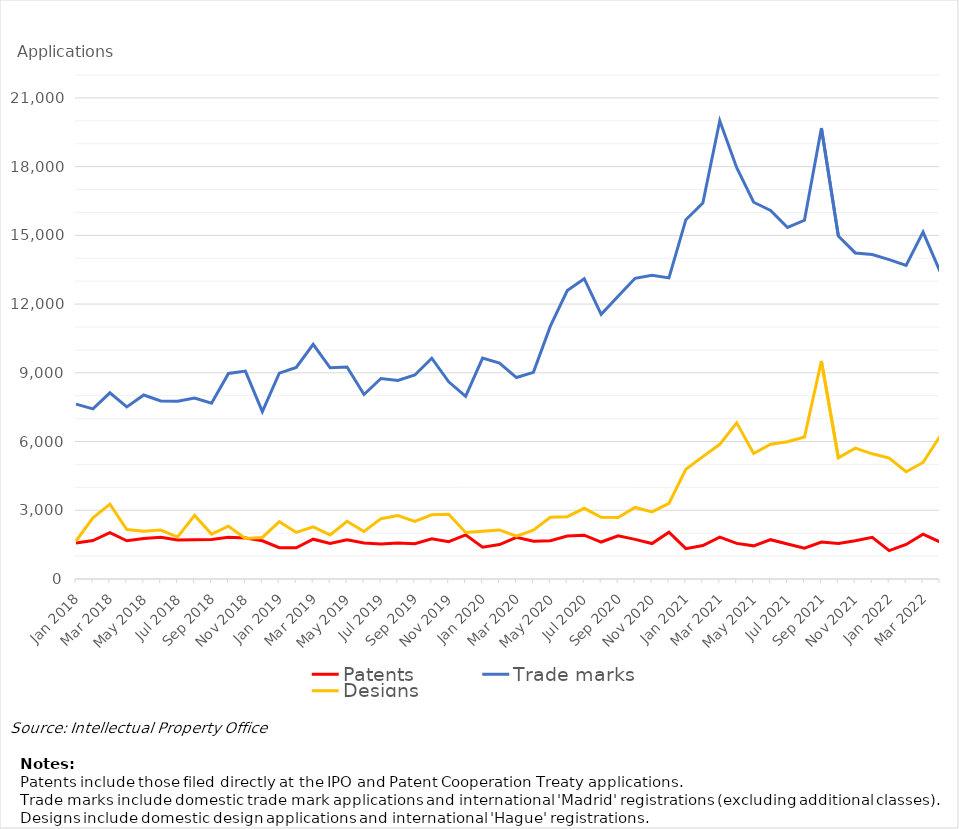
| Category | Patents | Trade marks | Designs |
|---|---|---|---|
| Jan 2018 | 1575 | 7634 | 1658 |
| Feb 2018 | 1676 | 7428 | 2672 |
| Mar 2018 | 2022 | 8127 | 3267 |
| Apr 2018 | 1670 | 7512 | 2160 |
| May 2018 | 1767 | 8030 | 2083 |
| Jun 2018 | 1821 | 7769 | 2136 |
| Jul 2018 | 1704 | 7757 | 1832 |
| Aug 2018 | 1713 | 7897 | 2777 |
| Sep 2018 | 1725 | 7673 | 1960 |
| Oct 2018 | 1818 | 8972 | 2302 |
| Nov 2018 | 1787 | 9076 | 1765 |
| Dec 2018 | 1670 | 7304 | 1815 |
| Jan 2019 | 1367 | 8985 | 2505 |
| Feb 2019 | 1361 | 9234 | 2031 |
| Mar 2019 | 1737 | 10243 | 2274 |
| Apr 2019 | 1552 | 9219 | 1923 |
| May 2019 | 1710 | 9251 | 2520 |
| Jun 2019 | 1569 | 8053 | 2074 |
| Jul 2019 | 1527 | 8752 | 2634 |
| Aug 2019 | 1571 | 8670 | 2768 |
| Sep 2019 | 1540 | 8907 | 2511 |
| Oct 2019 | 1755 | 9636 | 2800 |
| Nov 2019 | 1630 | 8607 | 2827 |
| Dec 2019 | 1926 | 7970 | 2028 |
| Jan 2020 | 1391 | 9642 | 2082 |
| Feb 2020 | 1505 | 9428 | 2143 |
| Mar 2020 | 1818 | 8794 | 1871 |
| Apr 2020 | 1648 | 9021 | 2127 |
| May 2020 | 1672 | 11035 | 2695 |
| Jun 2020 | 1879 | 12593 | 2721 |
| Jul 2020 | 1912 | 13110 | 3086 |
| Aug 2020 | 1614 | 11551 | 2694 |
| Sep 2020 | 1885 | 12340 | 2686 |
| Oct 2020 | 1730 | 13126 | 3124 |
| Nov 2020 | 1547 | 13254 | 2930 |
| Dec 2020 | 2043 | 13144 | 3302 |
| Jan 2021 | 1324 | 15685 | 4792 |
| Feb 2021 | 1462 | 16412 | 5341 |
| Mar 2021 | 1828 | 20001 | 5879 |
| Apr 2021 | 1555 | 17951 | 6815 |
| May 2021 | 1447 | 16446 | 5480 |
| Jun 2021 | 1716 | 16091 | 5881 |
| Jul 2021 | 1528 | 15345 | 5989 |
| Aug 2021 | 1344 | 15659 | 6200 |
| Sep 2021 | 1614 | 19685 | 9518 |
| Oct 2021 | 1547 | 14969 | 5289 |
| Nov 2021 | 1670 | 14233 | 5713 |
| Dec 2021 | 1817 | 14162 | 5464 |
| Jan 2022 | 1240 | 13944 | 5280 |
| Feb 2022 | 1507 | 13690 | 4681 |
| Mar 2022 | 1954 | 15141 | 5086 |
| Apr 2022 | 1617 | 13429 | 6230 |